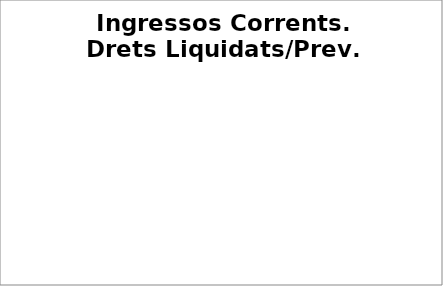
| Category | Series 0 |
|---|---|
| Impostos locals | 0.616 |
| Participació Tributs de l'Estat | 0.566 |
| Taxes i altres ingressos | 0.466 |
| Transferències corrents (exc. FCF) | 0.542 |
| Ingressos patrimonials | 0.366 |
| Ingressos corrents | 0.571 |